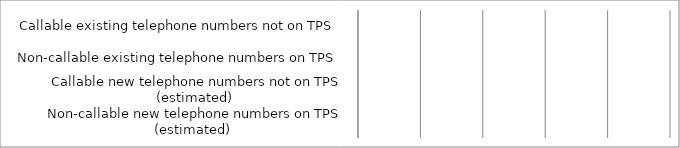
| Category | Series 0 |
|---|---|
|  Callable existing telephone numbers not on TPS  | 0 |
|  Non-callable existing telephone numbers on TPS  | 0 |
|  Callable new telephone numbers not on TPS (estimated)  | 0 |
|  Non-callable new telephone numbers on TPS (estimated)  | 0 |